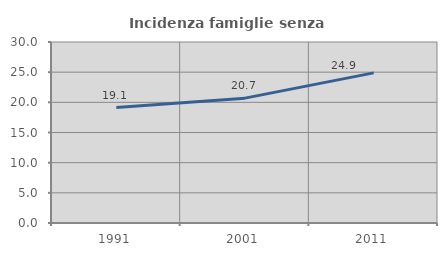
| Category | Incidenza famiglie senza nuclei |
|---|---|
| 1991.0 | 19.137 |
| 2001.0 | 20.695 |
| 2011.0 | 24.883 |